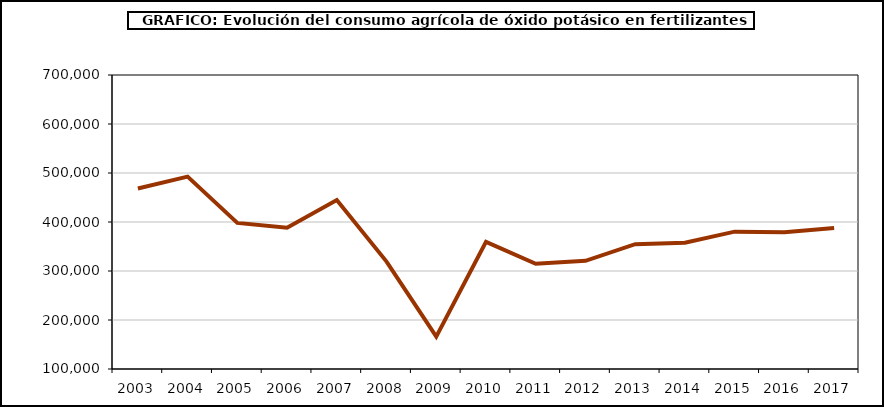
| Category | fertilizantes |
|---|---|
| 2003.0 | 468511 |
| 2004.0 | 492571 |
| 2005.0 | 398230 |
| 2006.0 | 388187 |
| 2007.0 | 444853 |
| 2008.0 | 319194 |
| 2009.0 | 166016 |
| 2010.0 | 359583 |
| 2011.0 | 314642 |
| 2012.0 | 320841 |
| 2013.0 | 354738 |
| 2014.0 | 357875 |
| 2015.0 | 380303 |
| 2016.0 | 379007 |
| 2017.0 | 387885 |